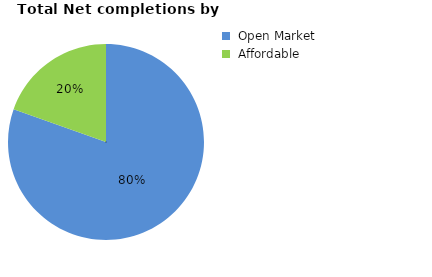
| Category | Net completions by tenure and financial year (2005/06 to 2019/20) |
|---|---|
|  Open Market | 0.804 |
|  Affordable | 0.196 |